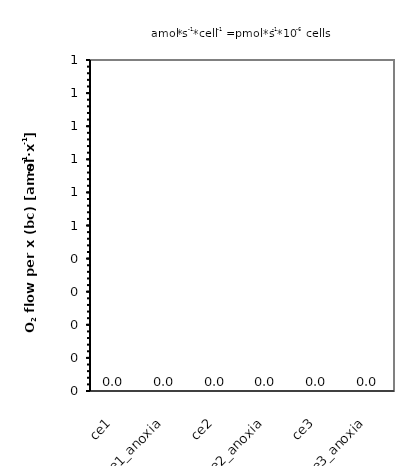
| Category | O2 flow per x (bc) |
|---|---|
| ce1 | 0 |
| ce1_anoxia | 0 |
| ce2 | 0 |
| ce2_anoxia | 0 |
| ce3 | 0 |
| ce3_anoxia | 0 |